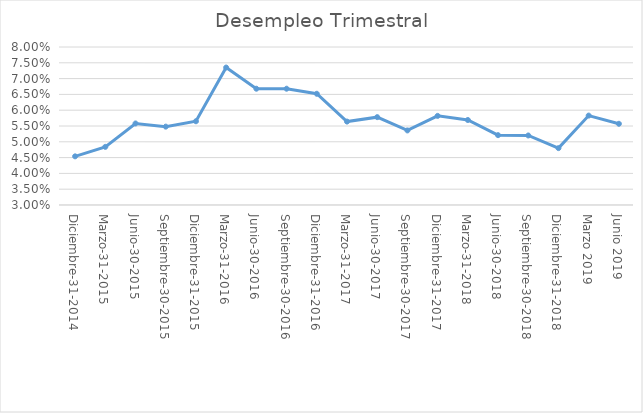
| Category | VALOR |
|---|---|
| Diciembre-31-2014 | 0.045 |
| Marzo-31-2015 | 0.048 |
| Junio-30-2015 | 0.056 |
| Septiembre-30-2015 | 0.055 |
| Diciembre-31-2015 | 0.056 |
| Marzo-31-2016 | 0.074 |
| Junio-30-2016 | 0.067 |
| Septiembre-30-2016 | 0.067 |
| Diciembre-31-2016 | 0.065 |
| Marzo-31-2017 | 0.056 |
| Junio-30-2017 | 0.058 |
| Septiembre-30-2017 | 0.054 |
| Diciembre-31-2017 | 0.058 |
| Marzo-31-2018 | 0.057 |
| Junio-30-2018 | 0.052 |
| Septiembre-30-2018 | 0.052 |
| Diciembre-31-2018 | 0.048 |
| Marzo 2019 | 0.058 |
| Junio 2019 | 0.056 |